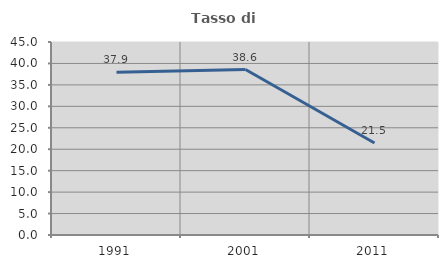
| Category | Tasso di occupazione   |
|---|---|
| 1991.0 | 37.937 |
| 2001.0 | 38.58 |
| 2011.0 | 21.467 |